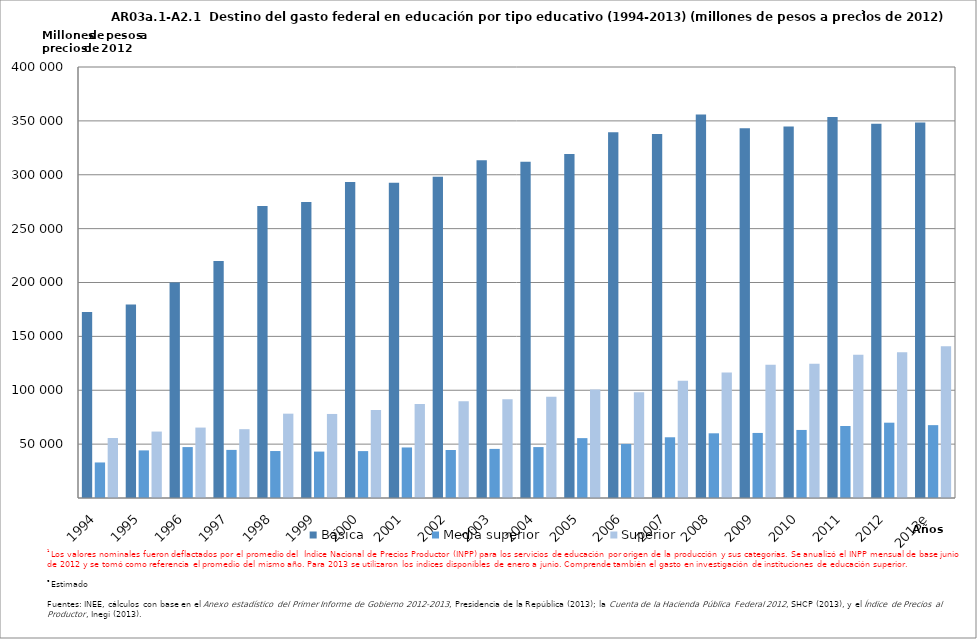
| Category | Básica | Media superior | Superior |
|---|---|---|---|
| 1994 | 172672.286 | 32978.989 | 55674.494 |
| 1995 | 179485.375 | 44189.346 | 61654.953 |
| 1996 | 200001.51 | 47255.099 | 65359.877 |
| ﻿1997 | 219870.594 | 44639.141 | 63866.036 |
| 1998 | 271016.757 | 43593.123 | 78266.916 |
| 1999 | 274692.827 | 43074.763 | 77992.121 |
| 2000 | 293309.891 | 43523.691 | 81757.737 |
| 2001 | 292460.259 | 46899.004 | 87180.413 |
| 2002 | 298107.729 | 44539.079 | 89719.319 |
| 2003 | 313484.258 | 45567.464 | 91741.125 |
| 2004 | 312031.314 | 47256.98 | 94009.33 |
| 2005 | 319344.106 | 55564.523 | 100619.993 |
| 2006 | 339472.845 | 50179.481 | 98216.821 |
| 2007 | 337830.546 | 56360.369 | 108786.118 |
| 2008 | 355986.852 | 60041.121 | 116557.425 |
| 2009 | 343049.027 | 60378.236 | 123759.157 |
| 2010 | 344672.187 | 63157.666 | 124614.908 |
| 2011 | 353541.289 | 66837.393 | 132887.597 |
| 2012 | 347411.93 | 69894.7 | 135269.669 |
| 2013e | 348491.89 | 67623.725 | 140728.226 |